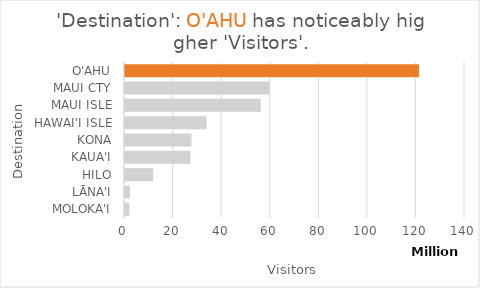
| Category | Total |
|---|---|
| O'AHU | 121048248 |
| MAUI CTY | 59533239 |
| MAUI ISLE | 55917720 |
| HAWAI'I ISLE | 33597222 |
| KONA | 27381724 |
| KAUA'I | 26906625 |
| HILO | 11620993 |
| LĀNA'I | 2016188 |
| MOLOKA'I | 1838975 |